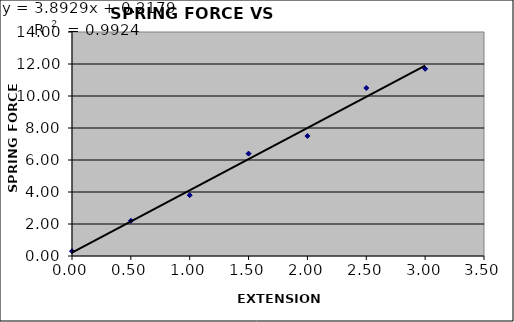
| Category | Force |
|---|---|
| 0.0 | 0.3 |
| 0.5 | 2.2 |
| 1.0 | 3.8 |
| 1.5 | 6.4 |
| 2.0 | 7.5 |
| 2.5 | 10.5 |
| 3.0 | 11.7 |